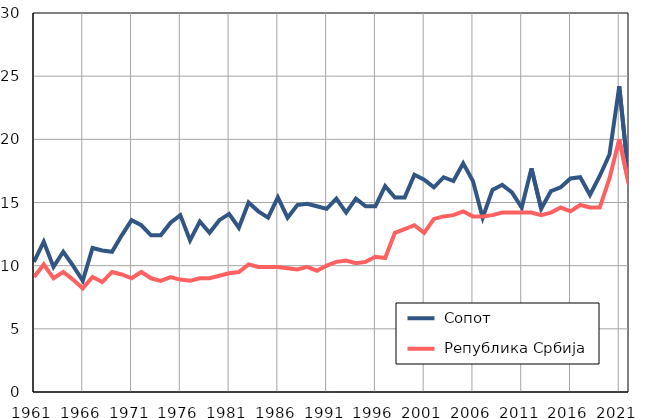
| Category |  Сопот |  Република Србија |
|---|---|---|
| 1961.0 | 10.3 | 9.1 |
| 1962.0 | 11.9 | 10.1 |
| 1963.0 | 9.9 | 9 |
| 1964.0 | 11.1 | 9.5 |
| 1965.0 | 10 | 8.9 |
| 1966.0 | 8.8 | 8.2 |
| 1967.0 | 11.4 | 9.1 |
| 1968.0 | 11.2 | 8.7 |
| 1969.0 | 11.1 | 9.5 |
| 1970.0 | 12.4 | 9.3 |
| 1971.0 | 13.6 | 9 |
| 1972.0 | 13.2 | 9.5 |
| 1973.0 | 12.4 | 9 |
| 1974.0 | 12.4 | 8.8 |
| 1975.0 | 13.4 | 9.1 |
| 1976.0 | 14 | 8.9 |
| 1977.0 | 12 | 8.8 |
| 1978.0 | 13.5 | 9 |
| 1979.0 | 12.6 | 9 |
| 1980.0 | 13.6 | 9.2 |
| 1981.0 | 14.1 | 9.4 |
| 1982.0 | 13 | 9.5 |
| 1983.0 | 15 | 10.1 |
| 1984.0 | 14.3 | 9.9 |
| 1985.0 | 13.8 | 9.9 |
| 1986.0 | 15.4 | 9.9 |
| 1987.0 | 13.8 | 9.8 |
| 1988.0 | 14.8 | 9.7 |
| 1989.0 | 14.9 | 9.9 |
| 1990.0 | 14.7 | 9.6 |
| 1991.0 | 14.5 | 10 |
| 1992.0 | 15.3 | 10.3 |
| 1993.0 | 14.2 | 10.4 |
| 1994.0 | 15.3 | 10.2 |
| 1995.0 | 14.7 | 10.3 |
| 1996.0 | 14.7 | 10.7 |
| 1997.0 | 16.3 | 10.6 |
| 1998.0 | 15.4 | 12.6 |
| 1999.0 | 15.4 | 12.9 |
| 2000.0 | 17.2 | 13.2 |
| 2001.0 | 16.8 | 12.6 |
| 2002.0 | 16.2 | 13.7 |
| 2003.0 | 17 | 13.9 |
| 2004.0 | 16.7 | 14 |
| 2005.0 | 18.1 | 14.3 |
| 2006.0 | 16.7 | 13.9 |
| 2007.0 | 13.8 | 13.9 |
| 2008.0 | 16 | 14 |
| 2009.0 | 16.4 | 14.2 |
| 2010.0 | 15.8 | 14.2 |
| 2011.0 | 14.6 | 14.2 |
| 2012.0 | 17.7 | 14.2 |
| 2013.0 | 14.5 | 14 |
| 2014.0 | 15.9 | 14.2 |
| 2015.0 | 16.2 | 14.6 |
| 2016.0 | 16.9 | 14.3 |
| 2017.0 | 17 | 14.8 |
| 2018.0 | 15.6 | 14.6 |
| 2019.0 | 17.1 | 14.6 |
| 2020.0 | 18.8 | 16.9 |
| 2021.0 | 24.2 | 20 |
| 2022.0 | 16.7 | 16.4 |